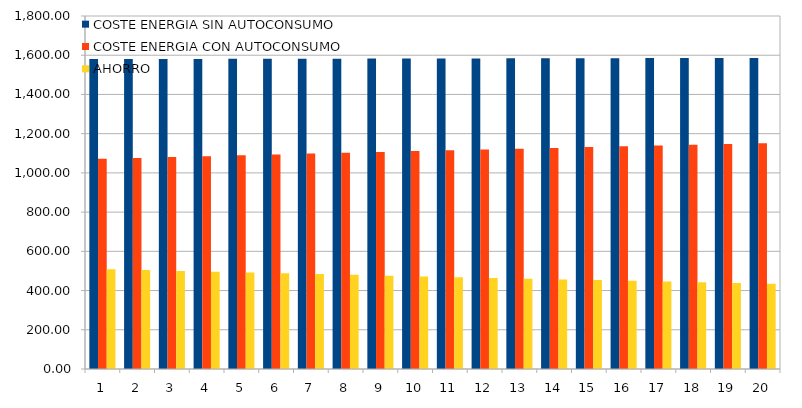
| Category | COSTE ENERGIA SIN AUTOCONSUMO | COSTE ENERGIA CON AUTOCONSUMO | AHORRO |
|---|---|---|---|
| 0 | 1580.366 | 1071.98 | 508.386 |
| 1 | 1580.682 | 1076.441 | 504.242 |
| 2 | 1580.999 | 1080.869 | 500.13 |
| 3 | 1581.315 | 1085.265 | 496.05 |
| 4 | 1581.631 | 1089.63 | 492.001 |
| 5 | 1581.947 | 1093.963 | 487.985 |
| 6 | 1582.264 | 1098.264 | 483.999 |
| 7 | 1582.58 | 1102.535 | 480.045 |
| 8 | 1582.897 | 1106.775 | 476.122 |
| 9 | 1583.213 | 1110.984 | 472.229 |
| 10 | 1583.53 | 1115.164 | 468.366 |
| 11 | 1583.847 | 1119.313 | 464.534 |
| 12 | 1584.163 | 1123.432 | 460.732 |
| 13 | 1584.48 | 1127.522 | 456.959 |
| 14 | 1584.797 | 1131.582 | 453.215 |
| 15 | 1585.114 | 1135.613 | 449.501 |
| 16 | 1585.431 | 1139.616 | 445.816 |
| 17 | 1585.748 | 1143.589 | 442.159 |
| 18 | 1586.065 | 1147.535 | 438.531 |
| 19 | 1586.383 | 1151.452 | 434.931 |